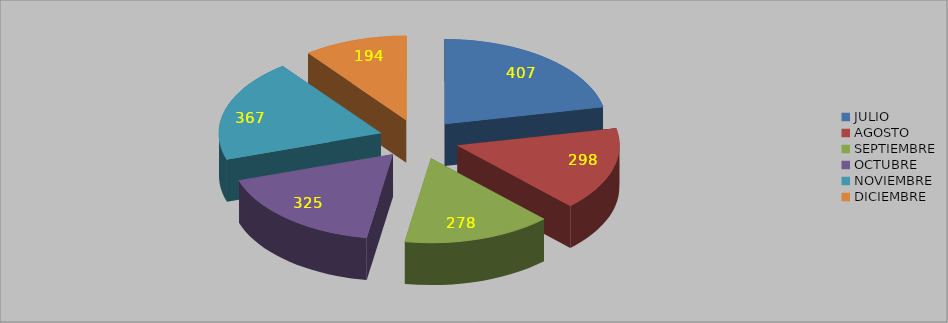
| Category | Series 0 |
|---|---|
| JULIO | 407 |
| AGOSTO | 298 |
| SEPTIEMBRE | 278 |
| OCTUBRE | 325 |
| NOVIEMBRE | 367 |
| DICIEMBRE | 194 |